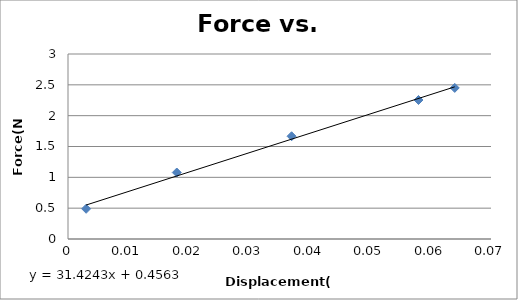
| Category | Force(N) |
|---|---|
| 0.003 | 0.49 |
| 0.018 | 1.078 |
| 0.037 | 1.666 |
| 0.058 | 2.254 |
| 0.064 | 2.45 |